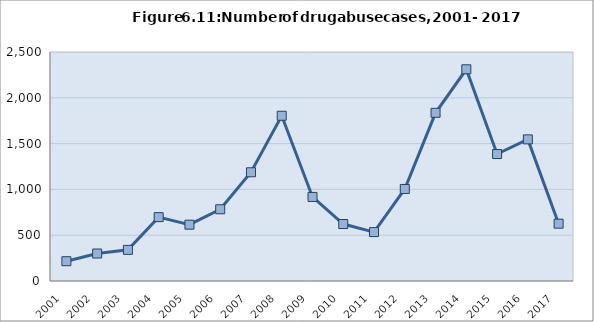
| Category | Series 1 |
|---|---|
| 2001.0 | 216 |
| 2002.0 | 300 |
| 2003.0 | 340 |
| 2004.0 | 697 |
| 2005.0 | 615 |
| 2006.0 | 783 |
| 2007.0 | 1187 |
| 2008.0 | 1804 |
| 2009.0 | 918 |
| 2010.0 | 622 |
| 2011.0 | 534 |
| 2012.0 | 1005 |
| 2013.0 | 1836 |
| 2014.0 | 2311 |
| 2015.0 | 1386 |
| 2016.0 | 1546 |
| 2017.0 | 626 |